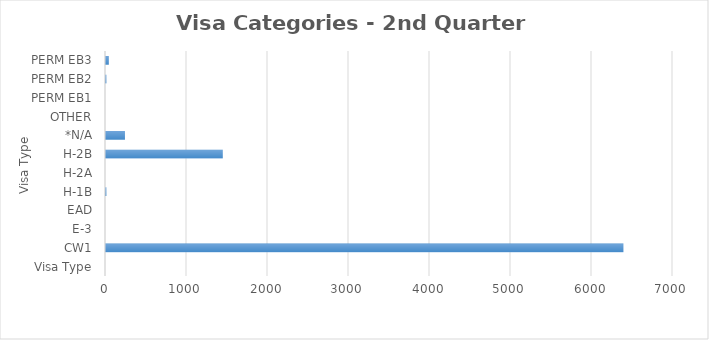
| Category | Series 0 |
|---|---|
| Visa Type | 0 |
| CW1 | 6388 |
| E-3 | 0 |
| EAD | 0 |
| H-1B | 5 |
| H-2A | 0 |
| H-2B | 1442 |
| *N/A | 234 |
| OTHER | 0 |
| PERM EB1 | 0 |
| PERM EB2 | 5 |
| PERM EB3 | 35 |